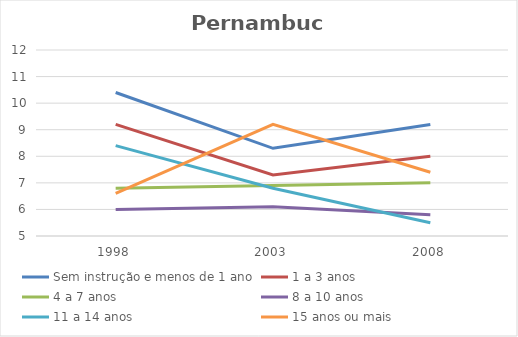
| Category | Sem instrução e menos de 1 ano | 1 a 3 anos | 4 a 7 anos | 8 a 10 anos | 11 a 14 anos | 15 anos ou mais |
|---|---|---|---|---|---|---|
| 1998.0 | 10.4 | 9.2 | 6.8 | 6 | 8.4 | 6.6 |
| 2003.0 | 8.3 | 7.3 | 6.9 | 6.1 | 6.8 | 9.2 |
| 2008.0 | 9.2 | 8 | 7 | 5.8 | 5.5 | 7.4 |